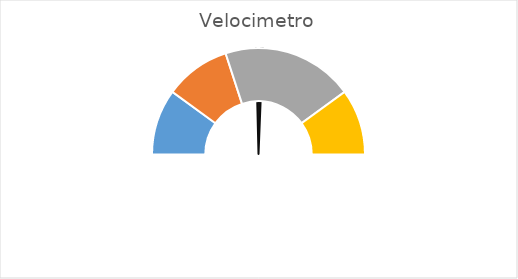
| Category | Series 0 |
|---|---|
| 0 | 49 |
| 1 | 2 |
| 2 | 148 |